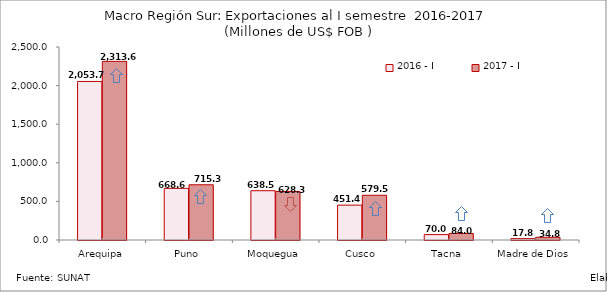
| Category | 2016 - I | 2017 - I |
|---|---|---|
| Arequipa | 2053.651 | 2313.597 |
| Puno | 668.626 | 715.314 |
| Moquegua | 638.467 | 628.264 |
| Cusco | 451.386 | 579.451 |
| Tacna | 69.958 | 84.004 |
| Madre de Dios | 17.778 | 34.825 |